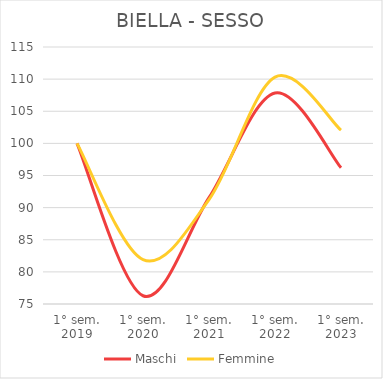
| Category | Maschi | Femmine |
|---|---|---|
| 1° sem.
2019 | 100 | 100 |
| 1° sem.
2020 | 76.284 | 81.901 |
| 1° sem.
2021 | 91.554 | 91.255 |
| 1° sem.
2022 | 107.838 | 110.304 |
| 1° sem.
2023 | 96.216 | 102.053 |